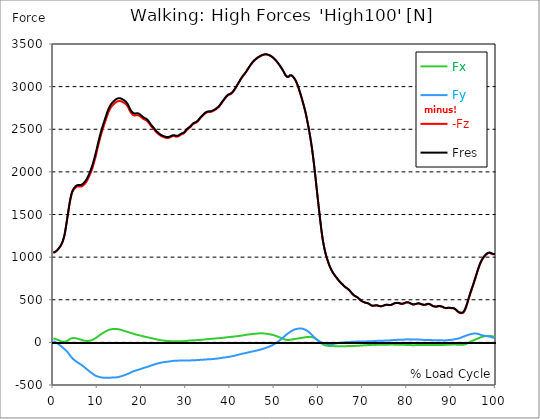
| Category |  Fx |  Fy |  -Fz |  Fres |
|---|---|---|---|---|
| 0.0 | 46.539 | 15.402 | 1050.334 | 1052.266 |
| 0.16678370786516855 | 44.331 | 11.246 | 1053.908 | 1055.768 |
| 0.3335674157303371 | 41.613 | 6.553 | 1058.224 | 1059.967 |
| 0.5003511235955057 | 38.577 | 1.787 | 1063.236 | 1064.878 |
| 0.6671348314606742 | 35.54 | -3.705 | 1070.225 | 1071.838 |
| 0.8339185393258427 | 32.794 | -9.386 | 1078.115 | 1079.684 |
| 1.0007022471910114 | 29.859 | -15.285 | 1087.37 | 1088.94 |
| 1.1674859550561796 | 26.677 | -21.824 | 1098.123 | 1099.721 |
| 1.3342696629213484 | 22.986 | -28.319 | 1109.325 | 1110.996 |
| 1.5010533707865168 | 19.15 | -34.392 | 1120.164 | 1121.908 |
| 1.6678370786516854 | 15.489 | -41.018 | 1133.401 | 1135.29 |
| 1.8346207865168538 | 12.249 | -48.384 | 1149.616 | 1151.68 |
| 2.001404494382023 | 9.285 | -56.114 | 1168.447 | 1170.757 |
| 2.1681882022471908 | 7.367 | -63.67 | 1191.593 | 1194.15 |
| 2.334971910112359 | 6.509 | -70.891 | 1219.214 | 1222.091 |
| 2.501755617977528 | 6.771 | -78.359 | 1252.575 | 1255.815 |
| 2.668539325842697 | 9.096 | -86.583 | 1297.763 | 1301.41 |
| 2.8353230337078656 | 12.568 | -94.851 | 1349.954 | 1354.037 |
| 3.0021067415730336 | 15.91 | -102.523 | 1403.99 | 1408.466 |
| 3.168890449438202 | 19.949 | -111.676 | 1459.698 | 1464.711 |
| 3.335674157303371 | 24.512 | -122.065 | 1517.004 | 1522.743 |
| 3.502457865168539 | 30.004 | -133.805 | 1573.06 | 1579.656 |
| 3.6692415730337076 | 35.743 | -145.938 | 1626.152 | 1633.722 |
| 3.8360252808988764 | 41.09 | -157.678 | 1673.054 | 1681.583 |
| 4.002808988764046 | 45.653 | -168.997 | 1712.866 | 1722.339 |
| 4.169592696629214 | 48.762 | -179.327 | 1743.931 | 1754.363 |
| 4.3363764044943816 | 50.331 | -188.394 | 1766.597 | 1777.945 |
| 4.50316011235955 | 50.593 | -196.371 | 1783.714 | 1795.846 |
| 4.669943820224718 | 50.404 | -203.854 | 1796.253 | 1809.141 |
| 4.836727528089888 | 49.881 | -211.119 | 1806.671 | 1820.285 |
| 5.003511235955056 | 48.762 | -218.166 | 1815.287 | 1829.642 |
| 5.170294943820225 | 47.077 | -224.326 | 1822.247 | 1837.242 |
| 5.337078651685394 | 44.941 | -230.022 | 1826.766 | 1842.385 |
| 5.5038623595505625 | 42.805 | -235.878 | 1828.669 | 1844.986 |
| 5.670646067415731 | 40.829 | -241.864 | 1829.715 | 1846.773 |
| 5.837429775280899 | 38.519 | -247.676 | 1829.846 | 1847.63 |
| 6.004213483146067 | 35.525 | -252.921 | 1827.826 | 1846.279 |
| 6.170997191011236 | 32.474 | -258.254 | 1826.519 | 1845.654 |
| 6.329002808988764 | 29.597 | -264.095 | 1827.826 | 1847.718 |
| 6.495786516853932 | 26.866 | -270.415 | 1831.778 | 1852.483 |
| 6.662570224719101 | 24.265 | -276.953 | 1837.518 | 1859.109 |
| 6.82935393258427 | 21.969 | -283.506 | 1844.666 | 1867.1 |
| 6.9961376404494375 | 20.138 | -290.306 | 1852.788 | 1876.123 |
| 7.162921348314607 | 18.802 | -297.397 | 1862.16 | 1886.44 |
| 7.329705056179775 | 17.872 | -304.618 | 1873.334 | 1898.601 |
| 7.496488764044945 | 17.291 | -311.854 | 1885.873 | 1912.114 |
| 7.663272471910113 | 16.971 | -318.959 | 1900.722 | 1927.908 |
| 7.830056179775281 | 17.131 | -325.948 | 1917.839 | 1945.91 |
| 7.996839887640449 | 17.828 | -332.922 | 1936.408 | 1965.38 |
| 8.16362359550562 | 18.918 | -339.853 | 1955.863 | 1985.737 |
| 8.330407303370787 | 20.56 | -346.769 | 1975.914 | 2006.689 |
| 8.497191011235955 | 22.87 | -353.671 | 1997.099 | 2028.76 |
| 8.663974719101123 | 25.849 | -360.515 | 2020.812 | 2053.329 |
| 8.830758426966291 | 29.263 | -367.097 | 2046.777 | 2080.079 |
| 8.99754213483146 | 33.535 | -373.446 | 2075.081 | 2109.11 |
| 9.16432584269663 | 38.402 | -379.258 | 2104.736 | 2139.39 |
| 9.331109550561798 | 43.415 | -384.634 | 2135.903 | 2171.108 |
| 9.497893258426966 | 48.791 | -389.371 | 2168.638 | 2204.28 |
| 9.664676966292134 | 54.574 | -393.541 | 2203.06 | 2239.05 |
| 9.831460674157304 | 60.648 | -397.13 | 2239.893 | 2276.116 |
| 9.998244382022472 | 66.983 | -399.876 | 2278.179 | 2314.504 |
| 10.16502808988764 | 73.129 | -402.419 | 2314.983 | 2351.409 |
| 10.331811797752808 | 78.926 | -405.034 | 2348.997 | 2385.555 |
| 10.498595505617978 | 85.087 | -407.272 | 2382.067 | 2418.726 |
| 10.665379213483147 | 91.32 | -409.102 | 2414.12 | 2450.823 |
| 10.832162921348315 | 97.437 | -410.773 | 2445.345 | 2482.105 |
| 10.998946629213483 | 103.322 | -412.197 | 2474.797 | 2511.601 |
| 11.165730337078653 | 108.64 | -413.534 | 2503.232 | 2540.05 |
| 11.33251404494382 | 113.696 | -414.449 | 2530.693 | 2567.497 |
| 11.49929775280899 | 118.796 | -415.132 | 2557.036 | 2593.811 |
| 11.666081460674157 | 123.765 | -415.597 | 2581.998 | 2618.715 |
| 11.832865168539326 | 128.676 | -415.975 | 2606.873 | 2643.503 |
| 11.999648876404493 | 133.399 | -416.004 | 2633.259 | 2669.729 |
| 12.166432584269662 | 138.019 | -415.699 | 2660.634 | 2696.871 |
| 12.333216292134832 | 142.262 | -414.784 | 2685.669 | 2721.615 |
| 12.5 | 145.763 | -414.086 | 2706.098 | 2741.826 |
| 12.66678370786517 | 148.437 | -413.796 | 2724.173 | 2759.756 |
| 12.833567415730336 | 150.82 | -413.636 | 2740.373 | 2775.841 |
| 13.000351123595506 | 152.927 | -413.549 | 2754.584 | 2789.964 |
| 13.167134831460674 | 154.714 | -413.447 | 2766.643 | 2801.951 |
| 13.333918539325843 | 156.051 | -413.171 | 2776.96 | 2812.165 |
| 13.500702247191011 | 157.053 | -412.648 | 2786.477 | 2821.537 |
| 13.667485955056181 | 157.562 | -412.023 | 2795.238 | 2830.153 |
| 13.834269662921349 | 157.678 | -411.558 | 2803.477 | 2838.232 |
| 14.001053370786519 | 157.475 | -411.369 | 2811.25 | 2845.86 |
| 14.167837078651687 | 157.082 | -410.817 | 2817.498 | 2851.948 |
| 14.334620786516853 | 156.269 | -409.945 | 2822.7 | 2856.917 |
| 14.501404494382026 | 155.237 | -408.608 | 2827.117 | 2861.044 |
| 14.668188202247192 | 154.336 | -406.923 | 2829.776 | 2863.383 |
| 14.834971910112362 | 152.898 | -404.845 | 2830.938 | 2864.139 |
| 15.001755617977528 | 150.98 | -402.651 | 2830.909 | 2863.717 |
| 15.168539325842698 | 148.829 | -400.297 | 2830.095 | 2862.468 |
| 15.335323033707864 | 146.359 | -397.522 | 2827.741 | 2859.649 |
| 15.502106741573034 | 143.671 | -394.805 | 2824.516 | 2855.958 |
| 15.6688904494382 | 140.823 | -392.059 | 2820.099 | 2851.076 |
| 15.83567415730337 | 137.917 | -389.153 | 2814.694 | 2845.206 |
| 16.00245786516854 | 135.171 | -386.073 | 2809.332 | 2839.365 |
| 16.16924157303371 | 132.411 | -382.833 | 2803.84 | 2833.379 |
| 16.336025280898877 | 129.548 | -379.447 | 2797.694 | 2826.739 |
| 16.502808988764045 | 126.947 | -376.163 | 2789.034 | 2817.658 |
| 16.669592696629216 | 124.099 | -372.763 | 2777.73 | 2805.918 |
| 16.83637640449438 | 121.455 | -369.392 | 2764.319 | 2792.1 |
| 17.003160112359552 | 118.796 | -365.774 | 2747.769 | 2775.158 |
| 17.169943820224717 | 116.094 | -361.837 | 2729.084 | 2756.066 |
| 17.336727528089888 | 113.478 | -357.507 | 2711.982 | 2738.485 |
| 17.503511235955056 | 110.892 | -353.133 | 2697.263 | 2723.272 |
| 17.670294943820224 | 108.291 | -348.92 | 2685.262 | 2710.747 |
| 17.837078651685395 | 105.661 | -344.982 | 2675.178 | 2700.169 |
| 18.003862359550563 | 102.959 | -341.481 | 2667.477 | 2692.018 |
| 18.17064606741573 | 100.271 | -338.371 | 2662.799 | 2686.904 |
| 18.3374297752809 | 97.612 | -335.363 | 2661.433 | 2685.087 |
| 18.504213483146067 | 95.025 | -332.399 | 2661.084 | 2684.303 |
| 18.662219101123597 | 92.41 | -329.711 | 2662.857 | 2685.625 |
| 18.829002808988765 | 89.925 | -327.314 | 2665.487 | 2687.863 |
| 18.995786516853933 | 87.76 | -324.495 | 2665.981 | 2687.95 |
| 19.1625702247191 | 85.915 | -321.764 | 2664.353 | 2685.959 |
| 19.32935393258427 | 84.23 | -319.25 | 2661.607 | 2682.908 |
| 19.49613764044944 | 82.21 | -316.62 | 2656.972 | 2677.939 |
| 19.662921348314608 | 80.147 | -313.656 | 2650.564 | 2671.182 |
| 19.829705056179776 | 77.865 | -310.547 | 2643.227 | 2663.467 |
| 19.996488764044944 | 75.483 | -307.35 | 2635.744 | 2655.621 |
| 20.163272471910112 | 73.056 | -304.139 | 2628.029 | 2647.528 |
| 20.33005617977528 | 70.499 | -301.175 | 2621.025 | 2640.176 |
| 20.49683988764045 | 68.247 | -298.632 | 2615.765 | 2634.625 |
| 20.663623595505616 | 66.154 | -296.133 | 2612.075 | 2630.63 |
| 20.830407303370787 | 64.382 | -293.401 | 2609.096 | 2627.317 |
| 20.997191011235955 | 62.842 | -290.931 | 2604.984 | 2622.9 |
| 21.163974719101123 | 61.185 | -288.795 | 2598.78 | 2616.434 |
| 21.330758426966295 | 59.311 | -286.369 | 2590.411 | 2607.789 |
| 21.497542134831463 | 57.349 | -283.201 | 2580.196 | 2597.211 |
| 21.66432584269663 | 55.417 | -280.034 | 2569.052 | 2585.718 |
| 21.8311095505618 | 53.325 | -276.75 | 2555.554 | 2571.871 |
| 21.997893258426966 | 51.232 | -273.423 | 2542.39 | 2558.344 |
| 22.164676966292134 | 49.343 | -270.648 | 2531.26 | 2546.923 |
| 22.331460674157306 | 47.251 | -267.727 | 2522.513 | 2537.827 |
| 22.498244382022467 | 45.086 | -264.574 | 2514.347 | 2529.298 |
| 22.66502808988764 | 42.979 | -261.566 | 2504.598 | 2519.229 |
| 22.831811797752806 | 40.916 | -258.704 | 2493.686 | 2508.027 |
| 22.99859550561798 | 38.795 | -255.871 | 2482.236 | 2496.301 |
| 23.165379213483146 | 36.761 | -253.125 | 2471.687 | 2485.476 |
| 23.332162921348313 | 34.915 | -250.698 | 2462.679 | 2476.221 |
| 23.49894662921348 | 33.23 | -248.533 | 2454.818 | 2468.157 |
| 23.665730337078653 | 31.573 | -246.499 | 2448.004 | 2461.124 |
| 23.83251404494382 | 29.815 | -244.378 | 2441.407 | 2454.31 |
| 23.999297752808985 | 28.13 | -242.213 | 2433.983 | 2446.682 |
| 24.166081460674157 | 26.633 | -240.135 | 2427.153 | 2439.649 |
| 24.332865168539325 | 25.398 | -238.231 | 2421.618 | 2433.924 |
| 24.499648876404496 | 24.163 | -236.43 | 2417.157 | 2429.275 |
| 24.666432584269664 | 22.943 | -234.584 | 2413.583 | 2425.497 |
| 24.833216292134832 | 21.795 | -232.797 | 2410.284 | 2422.01 |
| 25.0 | 20.734 | -231.359 | 2406.957 | 2418.523 |
| 25.16678370786517 | 19.572 | -230.196 | 2403.804 | 2415.254 |
| 25.33356741573034 | 18.54 | -229.194 | 2401.087 | 2412.449 |
| 25.500351123595504 | 17.785 | -228.38 | 2399.169 | 2410.444 |
| 25.66713483146067 | 17.116 | -227.596 | 2397.919 | 2409.122 |
| 25.833918539325843 | 16.462 | -226.68 | 2397.571 | 2408.672 |
| 26.00070224719101 | 15.838 | -225.605 | 2398.108 | 2409.093 |
| 26.16748595505618 | 15.242 | -224.312 | 2400.084 | 2410.938 |
| 26.334269662921347 | 14.762 | -223.135 | 2403.354 | 2414.077 |
| 26.50105337078652 | 14.355 | -222.103 | 2407.48 | 2418.087 |
| 26.667837078651687 | 13.861 | -220.81 | 2411.926 | 2422.388 |
| 26.834620786516858 | 13.309 | -219.357 | 2416.227 | 2426.514 |
| 27.001404494382022 | 12.743 | -217.861 | 2419.729 | 2429.842 |
| 27.16818820224719 | 12.394 | -216.669 | 2420.993 | 2430.975 |
| 27.334971910112362 | 12.307 | -215.885 | 2420.048 | 2429.958 |
| 27.50175561797753 | 12.336 | -215.318 | 2417.564 | 2427.415 |
| 27.668539325842698 | 12.365 | -215.042 | 2414.513 | 2424.349 |
| 27.835323033707866 | 12.379 | -214.867 | 2412.566 | 2422.373 |
| 28.002106741573037 | 12.321 | -214.62 | 2412.813 | 2422.591 |
| 28.168890449438205 | 12.089 | -214.126 | 2415.341 | 2425.061 |
| 28.335674157303373 | 11.987 | -213.603 | 2418.944 | 2428.606 |
| 28.502457865168537 | 12.016 | -213.037 | 2423.928 | 2433.503 |
| 28.669241573033705 | 12.132 | -212.572 | 2430.452 | 2439.969 |
| 28.836025280898877 | 12.307 | -212.267 | 2437.557 | 2447.016 |
| 29.002808988764052 | 12.757 | -212.354 | 2442.366 | 2451.811 |
| 29.169592696629213 | 13.513 | -212.862 | 2444.967 | 2454.441 |
| 29.336376404494384 | 14.326 | -213.429 | 2447.713 | 2457.23 |
| 29.50316011235955 | 15.009 | -213.72 | 2452.392 | 2461.909 |
| 29.669943820224724 | 15.532 | -213.545 | 2459.323 | 2468.796 |
| 29.836727528089884 | 16.157 | -213.182 | 2468.389 | 2477.805 |
| 30.003511235955056 | 17.058 | -213.066 | 2479.17 | 2488.542 |
| 30.170294943820224 | 18.075 | -213.197 | 2489.763 | 2499.12 |
| 30.337078651685395 | 19.136 | -213.342 | 2499.367 | 2508.695 |
| 30.503862359550563 | 20.269 | -213.153 | 2506.501 | 2515.815 |
| 30.670646067415728 | 21.301 | -213.037 | 2512.487 | 2521.772 |
| 30.837429775280903 | 22.1 | -212.659 | 2518.488 | 2527.744 |
| 30.99543539325843 | 22.608 | -211.932 | 2526.451 | 2535.619 |
| 31.162219101123597 | 22.87 | -211.002 | 2536.316 | 2545.368 |
| 31.32900280898876 | 23.204 | -210.102 | 2546.56 | 2555.525 |
| 31.495786516853936 | 23.669 | -209.477 | 2555.583 | 2564.475 |
| 31.6625702247191 | 24.323 | -209.23 | 2562.659 | 2571.508 |
| 31.82935393258427 | 24.919 | -208.954 | 2567.904 | 2576.738 |
| 31.996137640449433 | 25.442 | -208.765 | 2571.479 | 2580.284 |
| 32.162921348314605 | 25.892 | -208.62 | 2574.443 | 2583.248 |
| 32.329705056179776 | 26.241 | -208.285 | 2578.337 | 2587.098 |
| 32.49648876404494 | 26.72 | -207.908 | 2584.337 | 2593.07 |
| 32.66327247191011 | 27.49 | -207.646 | 2592.75 | 2601.439 |
| 32.83005617977528 | 28.246 | -207.254 | 2602.979 | 2611.624 |
| 32.996839887640455 | 28.493 | -206.15 | 2614.414 | 2622.958 |
| 33.16362359550562 | 28.813 | -205.191 | 2625.835 | 2634.291 |
| 33.330407303370784 | 29.278 | -204.45 | 2635.918 | 2644.302 |
| 33.497191011235955 | 29.801 | -203.825 | 2644.084 | 2652.424 |
| 33.66397471910113 | 30.614 | -203.505 | 2651.538 | 2659.849 |
| 33.83075842696629 | 31.704 | -203.055 | 2660.14 | 2668.393 |
| 33.997542134831455 | 32.91 | -202.226 | 2670.107 | 2678.287 |
| 34.164325842696634 | 34.043 | -201.529 | 2678.578 | 2686.7 |
| 34.3311095505618 | 35.148 | -200.861 | 2685.901 | 2693.965 |
| 34.49789325842697 | 36.252 | -200.134 | 2691.858 | 2699.864 |
| 34.66467696629213 | 37.153 | -199.524 | 2696.13 | 2704.078 |
| 34.831460674157306 | 38.039 | -199.073 | 2699.341 | 2707.26 |
| 34.99824438202247 | 38.882 | -198.957 | 2701.361 | 2709.28 |
| 35.16502808988764 | 39.725 | -198.87 | 2702.407 | 2710.326 |
| 35.331811797752806 | 40.625 | -198.391 | 2702.596 | 2710.5 |
| 35.49859550561798 | 41.497 | -197.722 | 2702.756 | 2710.631 |
| 35.66537921348315 | 42.137 | -196.85 | 2704.296 | 2712.113 |
| 35.83216292134831 | 42.703 | -196.138 | 2707.42 | 2715.208 |
| 35.998946629213485 | 43.11 | -195.281 | 2711.416 | 2719.131 |
| 36.16573033707865 | 43.502 | -194.424 | 2715.687 | 2723.345 |
| 36.33251404494382 | 44.156 | -193.494 | 2720.046 | 2727.631 |
| 36.499297752808985 | 45.057 | -192.651 | 2724.754 | 2732.28 |
| 36.666081460674164 | 46.06 | -191.939 | 2730.421 | 2737.903 |
| 36.83286516853932 | 46.946 | -191.126 | 2736.901 | 2744.326 |
| 36.99964887640449 | 47.614 | -190.08 | 2744.093 | 2751.431 |
| 37.166432584269664 | 48.312 | -188.975 | 2750.82 | 2758.1 |
| 37.333216292134836 | 48.98 | -187.74 | 2757.896 | 2765.089 |
| 37.5 | 49.634 | -186.52 | 2767.37 | 2774.461 |
| 37.666783707865164 | 50.39 | -185.11 | 2778.398 | 2785.402 |
| 37.833567415730336 | 51.087 | -183.744 | 2789.949 | 2796.851 |
| 38.00035112359551 | 51.843 | -182.292 | 2802.503 | 2809.318 |
| 38.16713483146068 | 52.743 | -180.562 | 2815.827 | 2822.54 |
| 38.333918539325836 | 53.688 | -179.109 | 2828.018 | 2834.614 |
| 38.50070224719101 | 54.748 | -178.049 | 2839.002 | 2845.526 |
| 38.66748595505618 | 55.984 | -177.119 | 2850.088 | 2856.569 |
| 38.83426966292135 | 57.219 | -176.131 | 2861.988 | 2868.411 |
| 39.001053370786515 | 58.279 | -175.041 | 2873.38 | 2879.729 |
| 39.16783707865169 | 59.311 | -174.053 | 2883.376 | 2889.668 |
| 39.33462078651686 | 60.328 | -172.92 | 2891.891 | 2898.11 |
| 39.50140449438202 | 61.142 | -171.554 | 2899.141 | 2905.273 |
| 39.668188202247194 | 61.955 | -170.406 | 2903.311 | 2909.385 |
| 39.83497191011236 | 62.725 | -169.113 | 2906.639 | 2912.639 |
| 40.00175561797753 | 63.394 | -167.311 | 2910.518 | 2916.446 |
| 40.168539325842694 | 64.236 | -165.466 | 2915.56 | 2921.372 |
| 40.335323033707866 | 65.225 | -163.635 | 2921.706 | 2927.431 |
| 40.50210674157304 | 66.242 | -161.804 | 2930.511 | 2936.149 |
| 40.6688904494382 | 67.215 | -159.93 | 2941.191 | 2946.726 |
| 40.83567415730337 | 68.203 | -157.939 | 2953.512 | 2958.946 |
| 41.00245786516854 | 69.366 | -155.978 | 2966.4 | 2971.747 |
| 41.16924157303371 | 70.383 | -153.828 | 2980.189 | 2985.419 |
| 41.33602528089887 | 71.313 | -151.648 | 2994.501 | 2999.644 |
| 41.502808988764045 | 72.242 | -149.498 | 3008.958 | 3014 |
| 41.669592696629216 | 73.172 | -147.187 | 3023.212 | 3028.152 |
| 41.83637640449439 | 74.088 | -144.848 | 3037.146 | 3041.984 |
| 42.00316011235955 | 75.076 | -142.48 | 3051.632 | 3056.383 |
| 42.16994382022472 | 76.311 | -140.257 | 3066.758 | 3071.422 |
| 42.33672752808989 | 77.764 | -138.237 | 3081.84 | 3086.431 |
| 42.50351123595506 | 79.217 | -136.275 | 3096.224 | 3100.757 |
| 42.670294943820224 | 80.728 | -134.314 | 3109.664 | 3114.139 |
| 42.83707865168539 | 82.224 | -132.396 | 3121.491 | 3125.894 |
| 43.00386235955057 | 83.677 | -130.493 | 3131.721 | 3136.065 |
| 43.17064606741573 | 85.189 | -128.575 | 3141.833 | 3146.149 |
| 43.32865168539326 | 86.685 | -126.628 | 3152.745 | 3157.017 |
| 43.495435393258425 | 87.964 | -124.608 | 3165.401 | 3169.614 |
| 43.6622191011236 | 89.228 | -122.588 | 3178.666 | 3182.837 |
| 43.82900280898876 | 90.434 | -120.598 | 3192.165 | 3196.262 |
| 43.99578651685393 | 91.654 | -118.68 | 3205.576 | 3209.63 |
| 44.162570224719104 | 92.773 | -116.704 | 3218.871 | 3222.866 |
| 44.32935393258427 | 93.805 | -114.684 | 3232.296 | 3236.248 |
| 44.49613764044944 | 94.822 | -112.635 | 3245.504 | 3249.412 |
| 44.66292134831461 | 95.824 | -110.514 | 3257.811 | 3261.646 |
| 44.82970505617978 | 96.841 | -108.48 | 3269.318 | 3273.11 |
| 44.99648876404493 | 97.873 | -106.533 | 3280.187 | 3283.921 |
| 45.16327247191011 | 98.89 | -104.673 | 3290.445 | 3294.15 |
| 45.33005617977528 | 99.878 | -102.9 | 3300.092 | 3303.754 |
| 45.49683988764045 | 100.779 | -101.171 | 3308.767 | 3312.399 |
| 45.66362359550561 | 101.622 | -99.37 | 3316.162 | 3319.737 |
| 45.83040730337079 | 102.363 | -97.495 | 3323.297 | 3326.842 |
| 45.99719101123596 | 102.944 | -95.534 | 3330.518 | 3334.02 |
| 46.16397471910113 | 103.438 | -93.558 | 3337.507 | 3340.936 |
| 46.33075842696629 | 104.15 | -91.509 | 3343.043 | 3346.428 |
| 46.497542134831455 | 105.487 | -89.417 | 3347.765 | 3351.136 |
| 46.66432584269663 | 106.315 | -86.787 | 3352.414 | 3355.713 |
| 46.83110955056179 | 106.576 | -84.2 | 3357.732 | 3360.943 |
| 46.99789325842696 | 106.576 | -81.759 | 3362.89 | 3366.043 |
| 47.164676966292134 | 106.242 | -79.304 | 3367.017 | 3370.083 |
| 47.331460674157306 | 105.748 | -76.616 | 3370.446 | 3373.439 |
| 47.49824438202247 | 105.196 | -73.957 | 3373.25 | 3376.171 |
| 47.66502808988764 | 104.528 | -71.196 | 3375.299 | 3378.132 |
| 47.83181179775281 | 103.583 | -68.218 | 3376.563 | 3379.295 |
| 47.99859550561797 | 102.45 | -65.05 | 3377.057 | 3379.672 |
| 48.16537921348314 | 101.346 | -62.202 | 3376.636 | 3379.178 |
| 48.33216292134831 | 100.241 | -59.311 | 3375.444 | 3377.914 |
| 48.498946629213485 | 98.905 | -55.954 | 3373.337 | 3375.706 |
| 48.66573033707865 | 97.277 | -52.366 | 3370.49 | 3372.8 |
| 48.83251404494382 | 95.635 | -48.893 | 3366.915 | 3369.167 |
| 48.99929775280899 | 93.994 | -45.507 | 3362.629 | 3364.808 |
| 49.166081460674164 | 92.424 | -42.035 | 3357.805 | 3359.926 |
| 49.33286516853933 | 90.463 | -37.705 | 3352.473 | 3354.536 |
| 49.499648876404486 | 88.327 | -32.997 | 3346.559 | 3348.549 |
| 49.666432584269664 | 86.162 | -28.333 | 3339.585 | 3341.517 |
| 49.83321629213483 | 83.837 | -23.611 | 3331.651 | 3333.482 |
| 50.0 | 81.411 | -18.773 | 3323.311 | 3325.026 |
| 50.166783707865164 | 78.679 | -13.498 | 3314.433 | 3316.046 |
| 50.33356741573034 | 75.701 | -7.933 | 3305.004 | 3306.515 |
| 50.50035112359551 | 72.417 | -2.165 | 3295.196 | 3296.605 |
| 50.66713483146068 | 68.915 | 4.054 | 3284.4 | 3285.722 |
| 50.83391853932584 | 65.399 | 10.491 | 3272.834 | 3274.099 |
| 51.00070224719101 | 61.868 | 17.044 | 3260.891 | 3262.097 |
| 51.16748595505618 | 58.352 | 23.684 | 3248.628 | 3249.79 |
| 51.33426966292134 | 54.937 | 30.469 | 3235.87 | 3237.004 |
| 51.50105337078652 | 51.697 | 37.284 | 3222.735 | 3223.883 |
| 51.66783707865169 | 48.631 | 44.127 | 3209.397 | 3210.53 |
| 51.83462078651686 | 45.609 | 51.247 | 3195.608 | 3196.771 |
| 52.00140449438202 | 42.355 | 58.613 | 3181.107 | 3182.313 |
| 52.168188202247194 | 38.766 | 66.532 | 3164.209 | 3165.488 |
| 52.33497191011236 | 35.293 | 74.582 | 3147.689 | 3149.069 |
| 52.50175561797752 | 32.227 | 82.602 | 3133.101 | 3134.641 |
| 52.668539325842694 | 30.091 | 89.867 | 3122.625 | 3124.339 |
| 52.835323033707866 | 28.449 | 96.827 | 3114.546 | 3116.45 |
| 53.00210674157304 | 27.505 | 103.496 | 3110.362 | 3112.468 |
| 53.1688904494382 | 28.043 | 109.933 | 3114.517 | 3116.856 |
| 53.33567415730337 | 29.292 | 115.876 | 3121.927 | 3124.499 |
| 53.502457865168545 | 30.731 | 121.586 | 3129.396 | 3132.2 |
| 53.669241573033716 | 31.733 | 127.296 | 3132.389 | 3135.411 |
| 53.83602528089887 | 32.881 | 132.759 | 3129.425 | 3132.679 |
| 54.002808988764045 | 34.058 | 138.121 | 3123.337 | 3126.838 |
| 54.169592696629216 | 35.38 | 142.712 | 3115.302 | 3119.05 |
| 54.33637640449438 | 36.949 | 147.071 | 3105.145 | 3109.141 |
| 54.50316011235955 | 38.649 | 150.631 | 3093.042 | 3097.241 |
| 54.669943820224724 | 40.277 | 153.406 | 3078.861 | 3083.234 |
| 54.836727528089895 | 41.788 | 155.528 | 3062.311 | 3066.845 |
| 55.00351123595506 | 43.313 | 157.213 | 3043.655 | 3048.305 |
| 55.17029494382022 | 44.694 | 158.986 | 3022.776 | 3027.571 |
| 55.337078651685395 | 45.871 | 160.918 | 2998.903 | 3003.843 |
| 55.50386235955056 | 47.077 | 162.545 | 2972.314 | 2977.413 |
| 55.66186797752809 | 48.544 | 163.446 | 2945.041 | 2950.286 |
| 55.82865168539326 | 50.099 | 162.894 | 2917.158 | 2922.462 |
| 55.995435393258425 | 51.494 | 162.197 | 2888.142 | 2893.504 |
| 56.1622191011236 | 52.918 | 161.383 | 2858.472 | 2863.877 |
| 56.32900280898877 | 54.385 | 160.511 | 2827.611 | 2833.059 |
| 56.49578651685393 | 56.056 | 158.492 | 2796.27 | 2801.704 |
| 56.6625702247191 | 57.96 | 155.31 | 2765.714 | 2771.061 |
| 56.82935393258427 | 59.587 | 151.503 | 2733.021 | 2738.252 |
| 56.99613764044943 | 60.982 | 147.333 | 2697.845 | 2702.945 |
| 57.16292134831461 | 61.955 | 142.669 | 2657.873 | 2662.813 |
| 57.329705056179776 | 62.653 | 137.859 | 2615.475 | 2620.284 |
| 57.49648876404495 | 63.495 | 132.062 | 2572.22 | 2576.84 |
| 57.66327247191011 | 64.251 | 125.727 | 2527.497 | 2531.899 |
| 57.83005617977529 | 64.832 | 118.229 | 2480.217 | 2484.328 |
| 57.99683988764044 | 64.847 | 110.5 | 2430.001 | 2433.808 |
| 58.16362359550561 | 64.396 | 102.479 | 2377.926 | 2381.399 |
| 58.33040730337079 | 63.525 | 93.63 | 2322.51 | 2325.619 |
| 58.497191011235955 | 61.839 | 84.753 | 2262.734 | 2265.48 |
| 58.66397471910112 | 59.471 | 75.831 | 2198.788 | 2201.185 |
| 58.83075842696629 | 56.303 | 67.055 | 2130.221 | 2132.285 |
| 58.99754213483147 | 52.162 | 58.817 | 2057.747 | 2059.505 |
| 59.164325842696634 | 47.12 | 50.956 | 1980.913 | 1982.395 |
| 59.33110955056179 | 41.701 | 43.284 | 1901.958 | 1903.163 |
| 59.49789325842697 | 35.889 | 35.802 | 1821.825 | 1822.799 |
| 59.664676966292134 | 29.641 | 28.624 | 1741.243 | 1741.984 |
| 59.8314606741573 | 22.914 | 22.274 | 1663.159 | 1663.712 |
| 59.99824438202247 | 15.765 | 16.724 | 1585.977 | 1586.398 |
| 60.16502808988765 | 8.529 | 11.609 | 1510.044 | 1510.393 |
| 60.33181179775281 | 1.206 | 6.916 | 1434.983 | 1435.288 |
| 60.49859550561798 | -5.986 | 2.703 | 1361.956 | 1362.246 |
| 60.66537921348315 | -13.077 | -0.785 | 1293.113 | 1293.447 |
| 60.83216292134831 | -19.659 | -3.778 | 1230.809 | 1231.231 |
| 60.99894662921348 | -25.18 | -6.538 | 1176.831 | 1177.354 |
| 61.16573033707864 | -29.67 | -9.357 | 1129.87 | 1130.539 |
| 61.33251404494383 | -33.128 | -12.176 | 1088.576 | 1089.39 |
| 61.49929775280899 | -35.845 | -14.791 | 1051.089 | 1052.019 |
| 61.66608146067416 | -37.69 | -17.102 | 1018.339 | 1019.371 |
| 61.83286516853932 | -38.955 | -18.903 | 989.396 | 990.529 |
| 61.99964887640451 | -39.957 | -20.255 | 962.501 | 963.721 |
| 62.16643258426967 | -40.829 | -21.315 | 936.434 | 937.742 |
| 62.33321629213482 | -41.555 | -22.056 | 911.545 | 912.925 |
| 62.5 | -41.933 | -22.187 | 889.619 | 891.043 |
| 62.66678370786517 | -42.137 | -21.911 | 870.338 | 871.791 |
| 62.833567415730336 | -42.384 | -21.272 | 852.801 | 854.283 |
| 63.0003511235955 | -42.718 | -20.356 | 836.135 | 837.631 |
| 63.16713483146068 | -43.081 | -19.194 | 821.169 | 822.68 |
| 63.33391853932585 | -43.531 | -17.712 | 807.22 | 808.761 |
| 63.500702247191015 | -44.011 | -16.099 | 794.071 | 795.626 |
| 63.66748595505618 | -44.403 | -14.399 | 782.069 | 783.653 |
| 63.83426966292135 | -44.839 | -12.685 | 770.823 | 772.436 |
| 64.00105337078651 | -45.217 | -11.173 | 759.868 | 761.495 |
| 64.16783707865169 | -45.348 | -9.837 | 748.491 | 750.147 |
| 64.33462078651687 | -45.333 | -8.602 | 737.128 | 738.785 |
| 64.50140449438203 | -45.449 | -7.454 | 726.318 | 728.004 |
| 64.6681882022472 | -45.522 | -6.32 | 715.987 | 717.687 |
| 64.83497191011236 | -45.682 | -5.231 | 706.267 | 707.996 |
| 65.00175561797754 | -45.914 | -4.185 | 697.273 | 699.017 |
| 65.16853932584269 | -45.972 | -3.211 | 688.744 | 690.502 |
| 65.33532303370787 | -45.9 | -2.296 | 680.418 | 682.177 |
| 65.50210674157304 | -45.74 | -1.279 | 671.875 | 673.618 |
| 65.66889044943821 | -45.391 | -0.291 | 662.997 | 664.741 |
| 65.83567415730337 | -44.941 | 0.712 | 654.497 | 656.226 |
| 66.00245786516854 | -44.621 | 1.715 | 647.261 | 648.961 |
| 66.1692415730337 | -44.302 | 2.572 | 641.188 | 642.888 |
| 66.33602528089888 | -43.967 | 3.444 | 635.405 | 637.076 |
| 66.50280898876404 | -43.72 | 4.17 | 629.491 | 631.162 |
| 66.66959269662921 | -43.59 | 4.679 | 623.04 | 624.711 |
| 66.83637640449439 | -43.473 | 4.998 | 615.223 | 616.908 |
| 67.00316011235955 | -43.386 | 5.245 | 605.822 | 607.537 |
| 67.16994382022472 | -43.386 | 5.521 | 595.738 | 597.482 |
| 67.33672752808988 | -43.27 | 5.899 | 585.321 | 587.079 |
| 67.50351123595506 | -43.052 | 6.233 | 574.903 | 576.675 |
| 67.67029494382022 | -42.718 | 6.553 | 565.109 | 566.897 |
| 67.83707865168539 | -42.34 | 7.003 | 556.421 | 558.208 |
| 67.99508426966291 | -41.933 | 7.541 | 549.054 | 550.841 |
| 68.16186797752809 | -41.454 | 8.209 | 543.228 | 545 |
| 68.32865168539327 | -41.076 | 8.878 | 538.491 | 540.263 |
| 68.49543539325843 | -40.727 | 9.299 | 534.611 | 536.384 |
| 68.6622191011236 | -40.291 | 9.59 | 530.223 | 531.981 |
| 68.82900280898876 | -39.637 | 9.735 | 523.699 | 525.414 |
| 68.99578651685394 | -38.969 | 9.662 | 516.115 | 517.815 |
| 69.1625702247191 | -38.344 | 9.619 | 507.949 | 509.62 |
| 69.32935393258425 | -37.894 | 9.677 | 499.827 | 501.498 |
| 69.49613764044945 | -37.487 | 9.735 | 492.344 | 494 |
| 69.66292134831461 | -36.906 | 9.822 | 485.675 | 487.331 |
| 69.82970505617978 | -36.223 | 9.982 | 480.124 | 481.737 |
| 69.99648876404494 | -35.613 | 10.156 | 475.678 | 477.277 |
| 70.16327247191012 | -35.002 | 10.432 | 471.973 | 473.542 |
| 70.33005617977528 | -34.378 | 10.723 | 468.544 | 470.084 |
| 70.49683988764045 | -33.782 | 11.014 | 465.536 | 467.062 |
| 70.66362359550561 | -33.259 | 11.362 | 463.27 | 464.752 |
| 70.83040730337079 | -32.794 | 11.769 | 461.773 | 463.241 |
| 70.99719101123596 | -32.329 | 12.205 | 460.175 | 461.628 |
| 71.16397471910112 | -31.806 | 12.597 | 457.036 | 458.475 |
| 71.3307584269663 | -31.225 | 12.903 | 452.576 | 453.985 |
| 71.49754213483146 | -30.658 | 13.048 | 447.054 | 448.435 |
| 71.66432584269663 | -30.149 | 13.106 | 440.647 | 442.027 |
| 71.83110955056179 | -29.699 | 13.193 | 434.617 | 435.983 |
| 71.99789325842697 | -29.394 | 13.426 | 430.505 | 431.871 |
| 72.16467696629215 | -29.205 | 13.803 | 429.037 | 430.403 |
| 72.3314606741573 | -29.118 | 14.283 | 428.776 | 430.156 |
| 72.49824438202248 | -29.22 | 14.951 | 429.706 | 431.101 |
| 72.66502808988764 | -29.423 | 15.779 | 431.58 | 433.019 |
| 72.8318117977528 | -29.612 | 16.608 | 433.687 | 435.155 |
| 72.99859550561797 | -29.554 | 17.305 | 434.326 | 435.808 |
| 73.16537921348315 | -29.19 | 17.61 | 433.309 | 434.777 |
| 73.33216292134833 | -28.638 | 17.683 | 431.072 | 432.51 |
| 73.49894662921349 | -27.984 | 17.639 | 428.398 | 429.793 |
| 73.66573033707864 | -27.316 | 17.61 | 425.55 | 426.916 |
| 73.83251404494382 | -26.749 | 17.552 | 423.327 | 424.649 |
| 73.99929775280899 | -26.401 | 17.668 | 422.586 | 423.894 |
| 74.16608146067415 | -26.343 | 18.032 | 423.443 | 424.751 |
| 74.33286516853933 | -26.43 | 18.511 | 425.027 | 426.364 |
| 74.49964887640449 | -26.677 | 19.165 | 427.555 | 428.921 |
| 74.66643258426967 | -26.895 | 19.833 | 430.607 | 432.002 |
| 74.83321629213484 | -27.258 | 20.618 | 433.992 | 435.431 |
| 75.0 | -27.679 | 21.446 | 437.392 | 438.889 |
| 75.16678370786516 | -27.897 | 22.231 | 440.124 | 441.649 |
| 75.33356741573033 | -27.839 | 22.754 | 441.126 | 442.666 |
| 75.5003511235955 | -27.505 | 23.015 | 440.371 | 441.911 |
| 75.66713483146067 | -27.098 | 23.146 | 438.932 | 440.472 |
| 75.83391853932585 | -26.648 | 23.219 | 437.407 | 438.918 |
| 76.00070224719101 | -26.255 | 23.291 | 436.564 | 438.06 |
| 76.16748595505618 | -25.834 | 23.553 | 436.651 | 438.133 |
| 76.33426966292136 | -25.587 | 24.003 | 438.307 | 439.804 |
| 76.50105337078652 | -25.587 | 24.686 | 441.591 | 443.102 |
| 76.66783707865167 | -25.79 | 25.5 | 445.674 | 447.243 |
| 76.83462078651685 | -26.154 | 26.415 | 450.382 | 452.009 |
| 77.00140449438202 | -26.517 | 27.316 | 454.828 | 456.528 |
| 77.1681882022472 | -26.749 | 28.057 | 458.068 | 459.812 |
| 77.33497191011236 | -26.866 | 28.537 | 460.102 | 461.86 |
| 77.50175561797754 | -26.837 | 29.002 | 461.207 | 463.008 |
| 77.6685393258427 | -26.909 | 29.408 | 461.846 | 463.677 |
| 77.83532303370787 | -27.069 | 29.757 | 461.788 | 463.648 |
| 78.00210674157303 | -27.258 | 29.99 | 460.538 | 462.427 |
| 78.1688904494382 | -27.258 | 30.149 | 458.649 | 460.567 |
| 78.33567415730337 | -27.258 | 30.266 | 456.63 | 458.548 |
| 78.50245786516854 | -27.185 | 30.28 | 454.029 | 455.961 |
| 78.66924157303372 | -27.113 | 30.353 | 451.704 | 453.636 |
| 78.83602528089888 | -27.185 | 30.673 | 450.876 | 452.837 |
| 79.00280898876404 | -27.447 | 31.21 | 451.951 | 453.956 |
| 79.16959269662921 | -27.839 | 31.951 | 454.61 | 456.673 |
| 79.33637640449439 | -28.275 | 32.779 | 458.126 | 460.262 |
| 79.50316011235955 | -28.755 | 33.695 | 461.802 | 464.011 |
| 79.66994382022472 | -29.263 | 34.523 | 465.188 | 467.469 |
| 79.8367275280899 | -29.67 | 35.017 | 467.425 | 469.75 |
| 80.00351123595506 | -29.931 | 35.235 | 468.312 | 470.68 |
| 80.17029494382022 | -30.222 | 35.322 | 467.905 | 470.302 |
| 80.32830056179776 | -30.818 | 35.206 | 466.147 | 468.588 |
| 80.49508426966293 | -31.355 | 34.944 | 462.761 | 465.231 |
| 80.66186797752809 | -31.762 | 34.552 | 458.373 | 460.872 |
| 80.82865168539325 | -32.126 | 34.102 | 453.564 | 456.077 |
| 80.99543539325842 | -32.343 | 33.738 | 448.725 | 451.254 |
| 81.1622191011236 | -32.474 | 33.361 | 444.802 | 447.345 |
| 81.32900280898878 | -32.489 | 33.07 | 442.405 | 444.933 |
| 81.49578651685394 | -32.489 | 33.084 | 442.928 | 445.456 |
| 81.6625702247191 | -32.474 | 33.302 | 445.195 | 447.723 |
| 81.82935393258427 | -32.373 | 33.375 | 447.868 | 450.382 |
| 81.99613764044945 | -32.198 | 33.288 | 449.888 | 452.372 |
| 82.16292134831461 | -32.155 | 33.244 | 452.125 | 454.595 |
| 82.32970505617978 | -32.256 | 33.259 | 454.595 | 457.066 |
| 82.49648876404494 | -32.213 | 33.07 | 456.048 | 458.489 |
| 82.66327247191012 | -32.184 | 32.649 | 455.54 | 457.952 |
| 82.83005617977528 | -32.155 | 32.111 | 453.666 | 456.048 |
| 82.99683988764045 | -32.038 | 31.414 | 450.832 | 453.186 |
| 83.16362359550563 | -31.849 | 30.731 | 447.432 | 449.742 |
| 83.33040730337079 | -31.602 | 30.164 | 443.989 | 446.255 |
| 83.49719101123596 | -31.384 | 29.728 | 441.504 | 443.742 |
| 83.66397471910112 | -31.094 | 29.35 | 440.007 | 442.216 |
| 83.8307584269663 | -30.745 | 28.973 | 439.252 | 441.402 |
| 83.99754213483146 | -30.426 | 28.769 | 439.673 | 441.809 |
| 84.16432584269663 | -30.353 | 28.827 | 441.678 | 443.8 |
| 84.33110955056179 | -30.513 | 28.943 | 444.483 | 446.619 |
| 84.49789325842697 | -30.687 | 29.031 | 447.752 | 449.873 |
| 84.66467696629213 | -30.832 | 29.031 | 450.178 | 452.3 |
| 84.8314606741573 | -30.949 | 28.827 | 450.382 | 452.489 |
| 84.99824438202248 | -31.137 | 28.377 | 448.943 | 451.05 |
| 85.16502808988764 | -31.254 | 27.796 | 445.892 | 447.984 |
| 85.3318117977528 | -31.254 | 27.113 | 440.894 | 442.972 |
| 85.49859550561797 | -31.123 | 26.444 | 434.995 | 437.043 |
| 85.66537921348315 | -30.934 | 25.761 | 429.037 | 431.072 |
| 85.83216292134831 | -30.832 | 25.151 | 424.751 | 426.756 |
| 85.99894662921348 | -30.716 | 24.686 | 421.743 | 423.734 |
| 86.16573033707866 | -30.527 | 24.149 | 419.419 | 421.38 |
| 86.33251404494384 | -30.542 | 23.843 | 418.373 | 420.32 |
| 86.499297752809 | -30.673 | 23.742 | 418.387 | 420.334 |
| 86.66608146067415 | -30.716 | 23.727 | 419.114 | 421.061 |
| 86.83286516853933 | -30.774 | 23.945 | 420.857 | 422.804 |
| 86.99964887640449 | -30.818 | 24.279 | 422.877 | 424.838 |
| 87.16643258426966 | -30.876 | 24.497 | 424.257 | 426.219 |
| 87.33321629213482 | -30.949 | 24.425 | 424.461 | 426.422 |
| 87.5 | -30.76 | 24.207 | 423.269 | 425.216 |
| 87.66678370786518 | -30.455 | 23.873 | 421.511 | 423.429 |
| 87.83356741573033 | -30.237 | 23.626 | 419.143 | 421.046 |
| 88.00035112359551 | -30.149 | 23.48 | 415.714 | 417.617 |
| 88.16713483146067 | -30.033 | 23.379 | 411.006 | 412.924 |
| 88.33391853932584 | -29.859 | 23.335 | 406.124 | 408.071 |
| 88.500702247191 | -29.554 | 23.408 | 402.651 | 404.613 |
| 88.66748595505618 | -28.943 | 23.655 | 401.242 | 403.174 |
| 88.83426966292136 | -28.362 | 24.192 | 401.024 | 402.956 |
| 89.00105337078652 | -27.97 | 25.064 | 401.896 | 403.857 |
| 89.16783707865169 | -27.679 | 26.023 | 403.392 | 405.397 |
| 89.33462078651687 | -27.49 | 26.851 | 404.773 | 406.836 |
| 89.50140449438203 | -27.185 | 27.49 | 404.961 | 407.039 |
| 89.6681882022472 | -26.779 | 27.984 | 404.061 | 406.167 |
| 89.83497191011236 | -26.328 | 28.682 | 402.332 | 404.453 |
| 90.00175561797754 | -25.95 | 29.626 | 401.038 | 403.218 |
| 90.16853932584269 | -25.776 | 31.007 | 401.358 | 403.654 |
| 90.33532303370787 | -25.732 | 32.678 | 401.881 | 404.322 |
| 90.50210674157303 | -25.805 | 34.32 | 399.716 | 402.332 |
| 90.6688904494382 | -25.776 | 35.918 | 394.994 | 397.798 |
| 90.83567415730336 | -25.892 | 37.385 | 389.095 | 392.088 |
| 91.00245786516854 | -26.27 | 38.896 | 382.368 | 385.608 |
| 91.1692415730337 | -26.662 | 40.538 | 373.751 | 377.311 |
| 91.33602528089888 | -27.084 | 42.238 | 365.033 | 368.927 |
| 91.50280898876404 | -27.592 | 44.302 | 356.78 | 361.096 |
| 91.66959269662922 | -27.941 | 46.699 | 350.765 | 355.502 |
| 91.83637640449439 | -28.246 | 49.242 | 346.363 | 351.535 |
| 92.00316011235955 | -28.377 | 52.337 | 343.486 | 349.181 |
| 92.16994382022472 | -28.537 | 55.751 | 341.582 | 347.859 |
| 92.3367275280899 | -28.638 | 59.413 | 341.321 | 348.237 |
| 92.50351123595506 | -28.522 | 63.045 | 342.861 | 350.358 |
| 92.66151685393258 | -28.173 | 66.358 | 346.624 | 354.586 |
| 92.82830056179776 | -27.069 | 69.729 | 355.298 | 363.639 |
| 92.99508426966291 | -24.948 | 73.1 | 370.468 | 379.04 |
| 93.16186797752809 | -22.173 | 76.659 | 390.911 | 399.673 |
| 93.32865168539325 | -18.773 | 79.914 | 414.479 | 423.313 |
| 93.49543539325842 | -14.675 | 82.733 | 440.749 | 449.51 |
| 93.66221910112358 | -10.011 | 85.334 | 468.748 | 477.364 |
| 93.82900280898876 | -5.115 | 88.036 | 497.618 | 506.104 |
| 93.99578651685393 | -0.232 | 90.841 | 526.547 | 534.931 |
| 94.1625702247191 | 4.344 | 93.471 | 554.227 | 562.581 |
| 94.32935393258427 | 8.602 | 95.853 | 580.569 | 588.968 |
| 94.49613764044945 | 12.743 | 97.888 | 606.476 | 614.918 |
| 94.66292134831461 | 16.68 | 99.82 | 631.758 | 640.258 |
| 94.82970505617978 | 20.429 | 101.506 | 657.461 | 666.005 |
| 94.99648876404494 | 24.12 | 102.973 | 683.499 | 692.057 |
| 95.16327247191012 | 27.868 | 104.005 | 710.059 | 718.574 |
| 95.33005617977528 | 31.573 | 104.237 | 737.157 | 745.541 |
| 95.49683988764046 | 35.264 | 103.772 | 764.619 | 772.828 |
| 95.66362359550563 | 39.027 | 102.755 | 792.371 | 800.333 |
| 95.83040730337078 | 42.849 | 101.418 | 820.588 | 828.289 |
| 95.99719101123594 | 46.655 | 99.646 | 847.948 | 855.358 |
| 96.16397471910112 | 50.273 | 97.19 | 873.535 | 880.669 |
| 96.33075842696628 | 53.76 | 94.212 | 898.105 | 904.948 |
| 96.49754213483145 | 57.16 | 90.913 | 920.844 | 927.411 |
| 96.66432584269663 | 60.488 | 87.659 | 940.953 | 947.288 |
| 96.8311095505618 | 63.35 | 84.927 | 958.244 | 964.404 |
| 96.99789325842697 | 65.704 | 82.602 | 973.456 | 979.486 |
| 97.16467696629213 | 67.767 | 80.481 | 986.766 | 992.679 |
| 97.3314606741573 | 69.83 | 78.432 | 998.796 | 1004.608 |
| 97.49824438202248 | 71.516 | 77.023 | 1009.752 | 1015.491 |
| 97.66502808988764 | 73.013 | 75.817 | 1019.618 | 1025.299 |
| 97.8318117977528 | 74.378 | 74.422 | 1028.118 | 1033.726 |
| 97.99859550561798 | 75.439 | 72.998 | 1035.702 | 1041.238 |
| 98.16537921348316 | 76.195 | 71.501 | 1042.139 | 1047.588 |
| 98.33216292134833 | 76.442 | 70.092 | 1046.687 | 1052.034 |
| 98.49894662921349 | 75.962 | 68.639 | 1048.532 | 1053.734 |
| 98.66573033707866 | 75.25 | 66.997 | 1048.401 | 1053.443 |
| 98.8325140449438 | 74.436 | 65.137 | 1046.425 | 1051.307 |
| 98.99929775280897 | 73.129 | 63.045 | 1042.27 | 1046.948 |
| 99.16608146067416 | 71.574 | 60.619 | 1037.882 | 1042.342 |
| 99.33286516853933 | 69.947 | 57.8 | 1034.467 | 1038.695 |
| 99.49964887640449 | 68.218 | 54.85 | 1032.535 | 1036.516 |
| 99.66643258426966 | 66.59 | 51.988 | 1032.172 | 1035.92 |
| 99.83321629213484 | 65.254 | 49.198 | 1033.072 | 1036.589 |
| 100.0 | 64.207 | 46.873 | 1033.93 | 1037.257 |